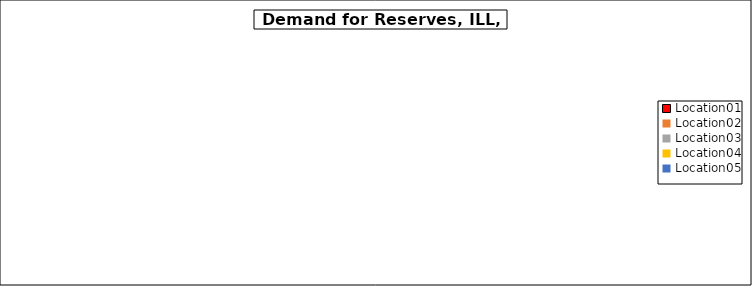
| Category | Series 0 |
|---|---|
| Location01 | 0 |
| Location02 | 0 |
| Location03 | 0 |
| Location04 | 0 |
| Location05 | 0 |